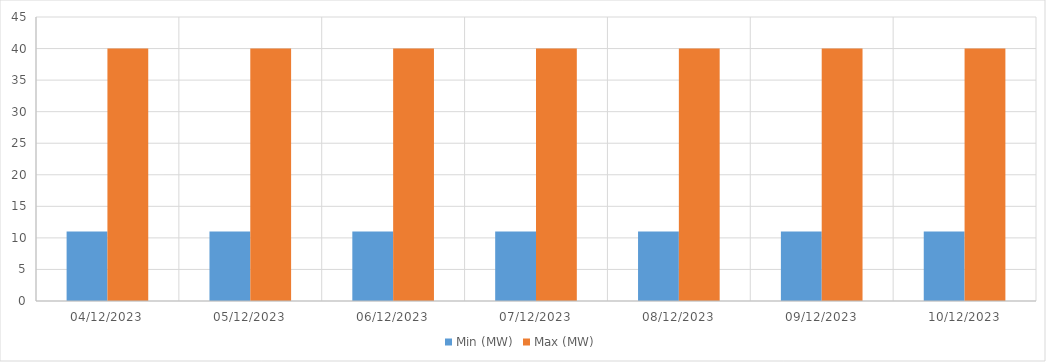
| Category | Min (MW) | Max (MW) |
|---|---|---|
| 04/12/2023 | 11 | 40 |
| 05/12/2023 | 11 | 40 |
| 06/12/2023 | 11 | 40 |
| 07/12/2023 | 11 | 40 |
| 08/12/2023 | 11 | 40 |
| 09/12/2023 | 11 | 40 |
| 10/12/2023 | 11 | 40 |